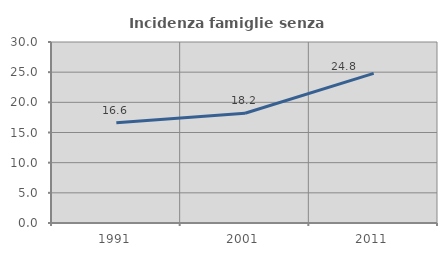
| Category | Incidenza famiglie senza nuclei |
|---|---|
| 1991.0 | 16.629 |
| 2001.0 | 18.182 |
| 2011.0 | 24.804 |